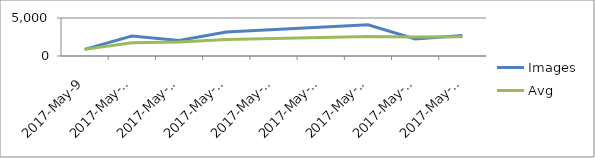
| Category | Images | Avg |
|---|---|---|
| 2017-05-09 | 871 | 871 |
| 2017-05-10 | 2619 | 1745 |
| 2017-05-11 | 2030 | 1840 |
| 2017-05-12 | 3147 | 2166.75 |
| 2017-05-15 | 4104 | 2554.2 |
| 2017-05-16 | 2231 | 2500.333 |
| 2017-05-17 | 2694 | 2528 |